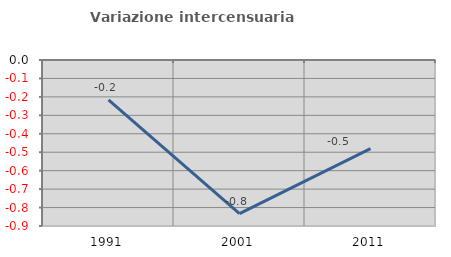
| Category | Variazione intercensuaria annua |
|---|---|
| 1991.0 | -0.217 |
| 2001.0 | -0.833 |
| 2011.0 | -0.48 |